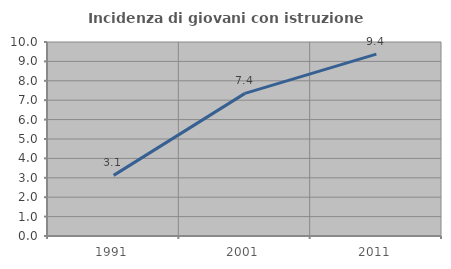
| Category | Incidenza di giovani con istruzione universitaria |
|---|---|
| 1991.0 | 3.125 |
| 2001.0 | 7.353 |
| 2011.0 | 9.375 |